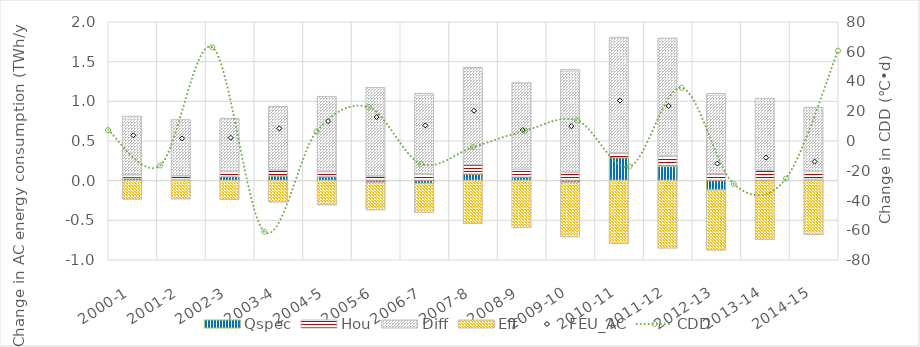
| Category | Qspec | Hou | Diff | Eff |
|---|---|---|---|---|
| 2000-1 | 0.025 | 0.047 | 0.74 | -0.24 |
| 2001-2 | 0.01 | 0.048 | 0.709 | -0.235 |
| 2002-3 | 0.048 | 0.066 | 0.672 | -0.243 |
| 2003-4 | 0.057 | 0.073 | 0.804 | -0.275 |
| 2004-5 | 0.046 | 0.065 | 0.951 | -0.311 |
| 2005-6 | -0.025 | 0.056 | 1.118 | -0.348 |
| 2006-7 | -0.039 | 0.08 | 1.02 | -0.365 |
| 2007-8 | 0.08 | 0.119 | 1.229 | -0.546 |
| 2008-9 | 0.04 | 0.099 | 1.096 | -0.597 |
| 2009-10 | -0.023 | 0.104 | 1.296 | -0.69 |
| 2010-11 | 0.286 | 0.058 | 1.462 | -0.797 |
| 2011-12 | 0.181 | 0.124 | 1.491 | -0.855 |
| 2012-13 | -0.118 | 0.082 | 1.016 | -0.764 |
| 2013-14 | -0.005 | 0.129 | 0.909 | -0.741 |
| 2014-15 | 0.013 | 0.103 | 0.808 | -0.684 |